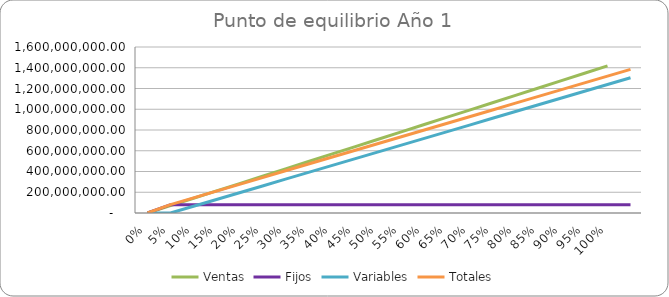
| Category | Ventas | Fijos | Variables | Totales |
|---|---|---|---|---|
| 0.0 | 0 | 0 | 0 | 0 |
| 0.05 | 70875000 | 80628171.105 | 0 | 80628171.105 |
| 0.1 | 141750000 | 80628171.105 | 65196904.33 | 145825075.436 |
| 0.15 | 212625000 | 80628171.105 | 130393808.66 | 211021979.766 |
| 0.2 | 283500000 | 80628171.105 | 195590712.99 | 276218884.096 |
| 0.25 | 354375000 | 80628171.105 | 260787617.32 | 341415788.426 |
| 0.3 | 425250000 | 80628171.105 | 325984521.651 | 406612692.756 |
| 0.35 | 496125000 | 80628171.105 | 391181425.981 | 471809597.086 |
| 0.4 | 567000000 | 80628171.105 | 456378330.311 | 537006501.416 |
| 0.45 | 637875000 | 80628171.105 | 521575234.641 | 602203405.746 |
| 0.5 | 708750000 | 80628171.105 | 586772138.971 | 667400310.076 |
| 0.55 | 779625000 | 80628171.105 | 651969043.301 | 732597214.407 |
| 0.6 | 850500000 | 80628171.105 | 717165947.631 | 797794118.737 |
| 0.65 | 921375000 | 80628171.105 | 782362851.961 | 862991023.067 |
| 0.7 | 992250000 | 80628171.105 | 847559756.291 | 928187927.397 |
| 0.75 | 1063125000 | 80628171.105 | 912756660.621 | 993384831.727 |
| 0.8 | 1134000000 | 80628171.105 | 977953564.952 | 1058581736.057 |
| 0.85 | 1204875000 | 80628171.105 | 1043150469.282 | 1123778640.387 |
| 0.9 | 1275750000 | 80628171.105 | 1108347373.612 | 1188975544.717 |
| 0.95 | 1346625000 | 80628171.105 | 1173544277.942 | 1254172449.047 |
| 1.0 | 1417500000 | 80628171.105 | 1238741182.272 | 1319369353.377 |